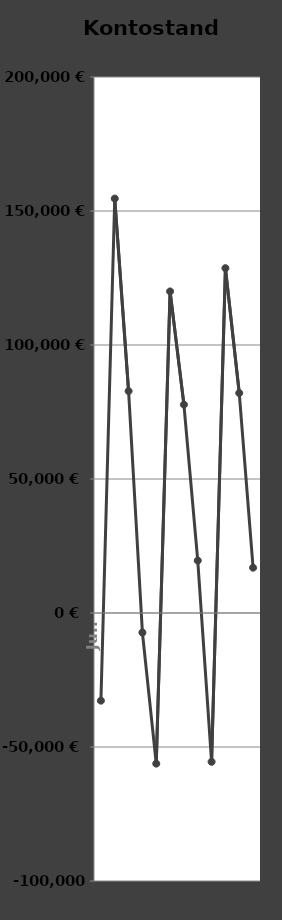
| Category | Liquidität Monatsende |
|---|---|
| 2019-07-01 | -32711 |
| 2019-08-01 | 154634 |
| 2019-09-01 | 82798 |
| 2019-10-01 | -7293 |
| 2019-11-01 | -56204 |
| 2019-12-01 | 119985 |
| 2020-01-01 | 77774 |
| 2020-02-01 | 19563 |
| 2020-03-01 | -55523 |
| 2020-04-01 | 128666 |
| 2020-05-01 | 82075 |
| 2020-06-01 | 16909 |